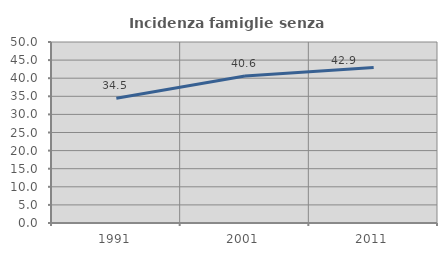
| Category | Incidenza famiglie senza nuclei |
|---|---|
| 1991.0 | 34.463 |
| 2001.0 | 40.609 |
| 2011.0 | 42.932 |